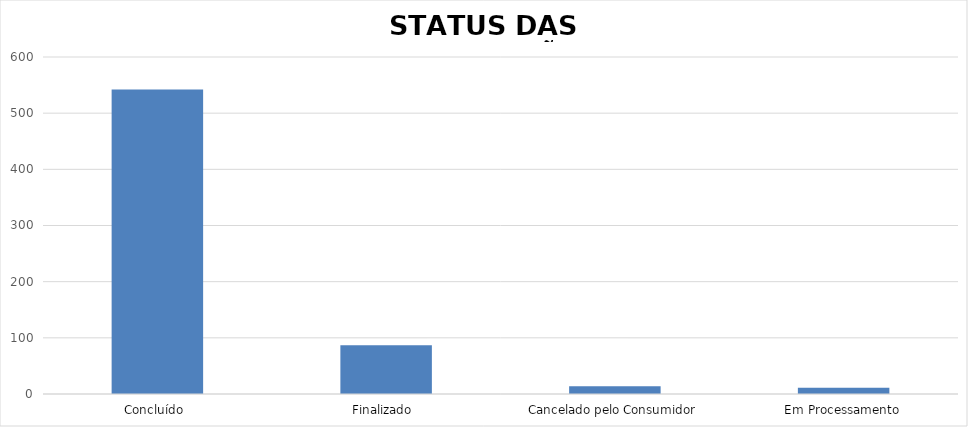
| Category | Series 0 |
|---|---|
| Concluído  | 542 |
| Finalizado  | 87 |
| Cancelado pelo Consumidor | 14 |
| Em Processamento | 11 |